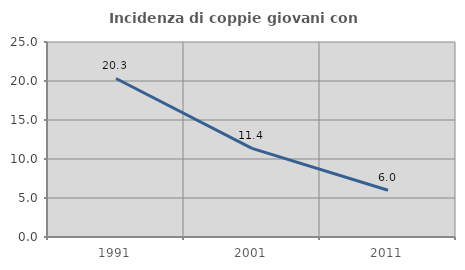
| Category | Incidenza di coppie giovani con figli |
|---|---|
| 1991.0 | 20.325 |
| 2001.0 | 11.355 |
| 2011.0 | 6 |